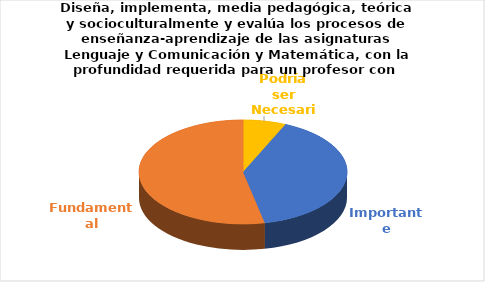
| Category | Series 0 |
|---|---|
| Podría ser Necesaria | 1 |
| Importante | 6 |
| Fundamental | 8 |